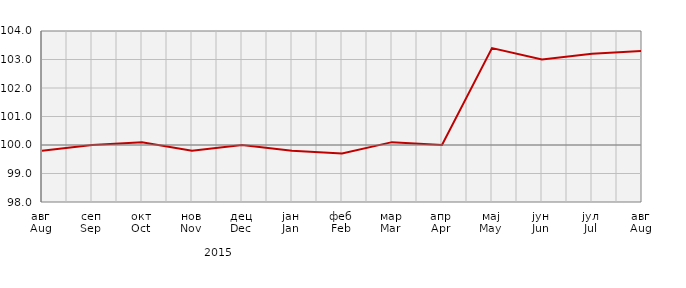
| Category | Индекси цијена произвођача
Producer price indices |
|---|---|
| авг
Aug | 99.8 |
| сеп
Sep | 100 |
| окт
Oct | 100.1 |
| нов
Nov | 99.8 |
| дец
Dec | 100 |
| јан
Jan | 99.8 |
| феб
Feb | 99.7 |
| мар
Mar | 100.1 |
| апр
Apr | 100 |
| мај
May | 103.4 |
| јун
Jun | 103 |
| јул
Jul | 103.2 |
| авг
Aug | 103.3 |